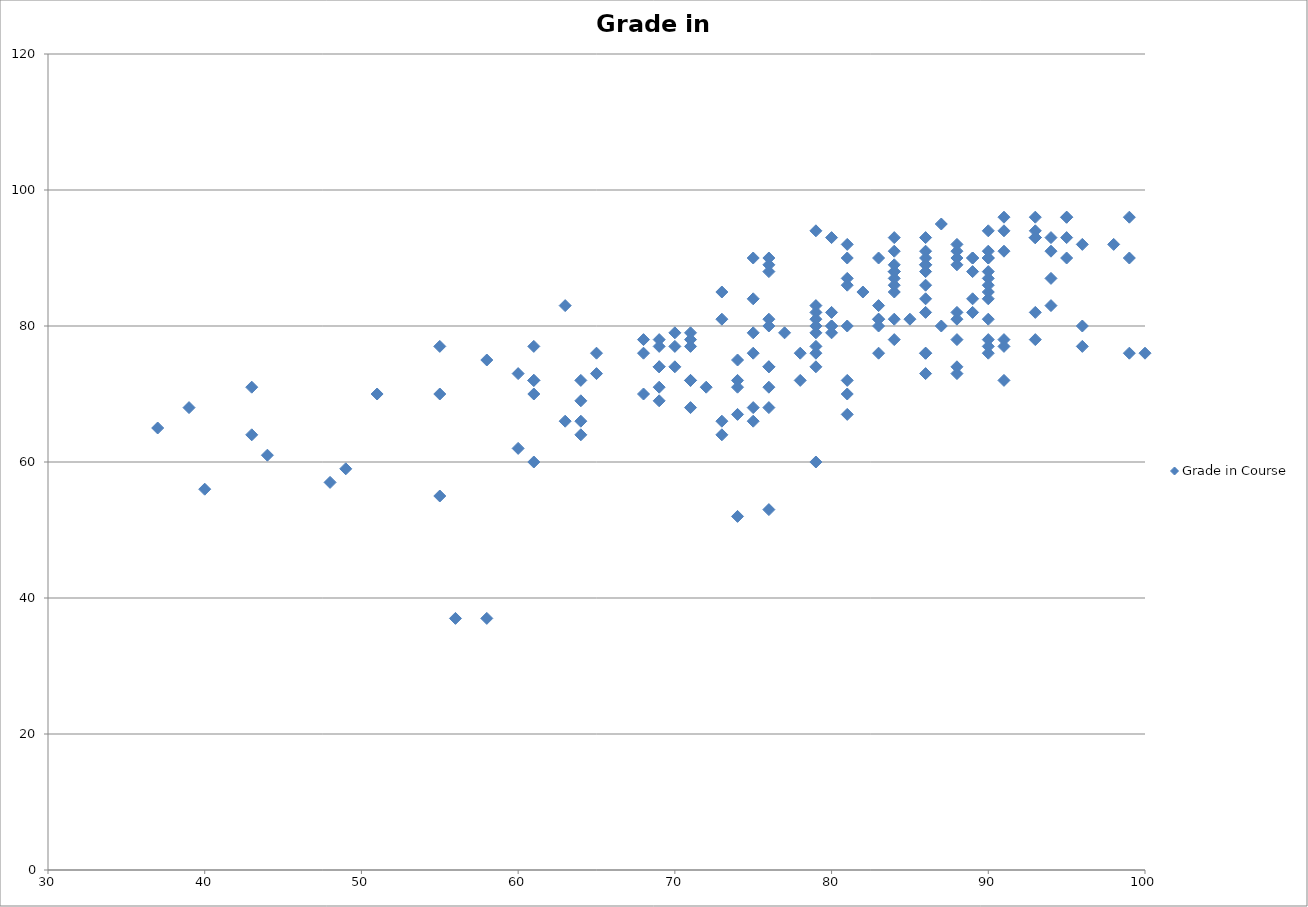
| Category | Grade in Course |
|---|---|
| 68.0 | 70 |
| 81.0 | 87 |
| 84.0 | 91 |
| 73.0 | 66 |
| 64.0 | 69 |
| 74.0 | 52 |
| 73.0 | 64 |
| 81.0 | 72 |
| 75.0 | 66 |
| 48.0 | 57 |
| 81.0 | 70 |
| 90.0 | 76 |
| 72.0 | 71 |
| 79.0 | 74 |
| 86.0 | 93 |
| 87.0 | 95 |
| 96.0 | 80 |
| 91.0 | 94 |
| 58.0 | 37 |
| 75.0 | 68 |
| 99.0 | 96 |
| 84.0 | 78 |
| 61.0 | 60 |
| 76.0 | 53 |
| 43.0 | 71 |
| 37.0 | 65 |
| 78.0 | 72 |
| 89.0 | 82 |
| 68.0 | 78 |
| 98.0 | 92 |
| 79.0 | 94 |
| 74.0 | 72 |
| 61.0 | 72 |
| 83.0 | 80 |
| 94.0 | 91 |
| 71.0 | 72 |
| 95.0 | 96 |
| 77.0 | 79 |
| 76.0 | 74 |
| 51.0 | 70 |
| 86.0 | 89 |
| 74.0 | 67 |
| 71.0 | 79 |
| 40.0 | 56 |
| 61.0 | 72 |
| 68.0 | 76 |
| 64.0 | 64 |
| 76.0 | 74 |
| 87.0 | 80 |
| 79.0 | 76 |
| 95.0 | 90 |
| 55.0 | 55 |
| 65.0 | 76 |
| 58.0 | 75 |
| 91.0 | 77 |
| 61.0 | 77 |
| 82.0 | 85 |
| 76.0 | 89 |
| 49.0 | 59 |
| 84.0 | 89 |
| 73.0 | 85 |
| 93.0 | 78 |
| 88.0 | 89 |
| 80.0 | 80 |
| 90.0 | 88 |
| 64.0 | 72 |
| 86.0 | 82 |
| 63.0 | 83 |
| 71.0 | 78 |
| 84.0 | 87 |
| 79.0 | 82 |
| 69.0 | 77 |
| 80.0 | 82 |
| 81.0 | 80 |
| 93.0 | 93 |
| 80.0 | 80 |
| 79.0 | 77 |
| 55.0 | 70 |
| 90.0 | 85 |
| 86.0 | 86 |
| 84.0 | 88 |
| 88.0 | 90 |
| 81.0 | 92 |
| 44.0 | 61 |
| 43.0 | 64 |
| 79.0 | 83 |
| 96.0 | 92 |
| 84.0 | 88 |
| 88.0 | 92 |
| 79.0 | 79 |
| 69.0 | 78 |
| 100.0 | 76 |
| 90.0 | 90 |
| 86.0 | 84 |
| 76.0 | 80 |
| 76.0 | 81 |
| 79.0 | 81 |
| 90.0 | 87 |
| 80.0 | 79 |
| 90.0 | 90 |
| 75.0 | 79 |
| 56.0 | 37 |
| 86.0 | 76 |
| 63.0 | 66 |
| 71.0 | 68 |
| 99.0 | 90 |
| 71.0 | 72 |
| 73.0 | 81 |
| 94.0 | 93 |
| 86.0 | 89 |
| 95.0 | 93 |
| 88.0 | 91 |
| 88.0 | 82 |
| 83.0 | 81 |
| 76.0 | 71 |
| 91.0 | 96 |
| 81.0 | 67 |
| 90.0 | 81 |
| 93.0 | 96 |
| 60.0 | 62 |
| 89.0 | 90 |
| 60.0 | 73 |
| 39.0 | 68 |
| 81.0 | 90 |
| 95.0 | 96 |
| 69.0 | 71 |
| 80.0 | 93 |
| 90.0 | 91 |
| 83.0 | 90 |
| 64.0 | 66 |
| 69.0 | 74 |
| 89.0 | 90 |
| 89.0 | 88 |
| 76.0 | 68 |
| 79.0 | 60 |
| 69.0 | 74 |
| 78.0 | 76 |
| 75.0 | 76 |
| 70.0 | 79 |
| 83.0 | 81 |
| 88.0 | 78 |
| 86.0 | 88 |
| 79.0 | 80 |
| 84.0 | 93 |
| 96.0 | 77 |
| 84.0 | 85 |
| 86.0 | 91 |
| 90.0 | 86 |
| 74.0 | 71 |
| 81.0 | 86 |
| 91.0 | 78 |
| 65.0 | 73 |
| 69.0 | 69 |
| 93.0 | 93 |
| 94.0 | 87 |
| 85.0 | 81 |
| 90.0 | 94 |
| 76.0 | 90 |
| 61.0 | 70 |
| 74.0 | 75 |
| 93.0 | 93 |
| 88.0 | 81 |
| 88.0 | 74 |
| 86.0 | 90 |
| 76.0 | 88 |
| 70.0 | 77 |
| 71.0 | 77 |
| 89.0 | 84 |
| 84.0 | 81 |
| 93.0 | 82 |
| 90.0 | 77 |
| 90.0 | 78 |
| 55.0 | 77 |
| 91.0 | 72 |
| 88.0 | 73 |
| 83.0 | 76 |
| 83.0 | 83 |
| 86.0 | 76 |
| 70.0 | 74 |
| 75.0 | 90 |
| 84.0 | 86 |
| 99.0 | 76 |
| 93.0 | 94 |
| 86.0 | 73 |
| 91.0 | 91 |
| 75.0 | 84 |
| 94.0 | 83 |
| 90.0 | 84 |